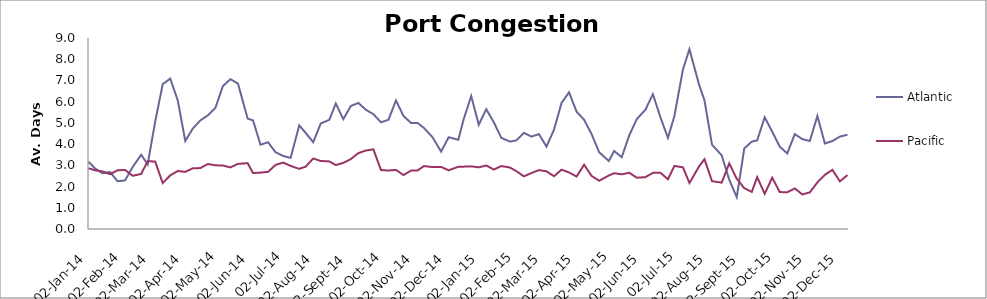
| Category | Atlantic  | Pacific |
|---|---|---|
| 2014-01-02 | 3.167 | 2.863 |
| 2014-01-08 | 2.854 | 2.767 |
| 2014-01-15 | 2.625 | 2.712 |
| 2014-01-22 | 2.688 | 2.582 |
| 2014-01-29 | 2.25 | 2.767 |
| 2014-02-05 | 2.292 | 2.781 |
| 2014-02-12 | 2.917 | 2.507 |
| 2014-02-20 | 3.5 | 2.596 |
| 2014-02-26 | 3.042 | 3.199 |
| 2014-03-05 | 5.059 | 3.178 |
| 2014-03-12 | 6.824 | 2.164 |
| 2014-03-19 | 7.088 | 2.527 |
| 2014-03-26 | 6.059 | 2.733 |
| 2014-04-02 | 4.147 | 2.692 |
| 2014-04-09 | 4.735 | 2.863 |
| 2014-04-16 | 5.118 | 2.87 |
| 2014-04-23 | 5.353 | 3.062 |
| 2014-04-30 | 5.706 | 3 |
| 2014-05-07 | 6.735 | 2.993 |
| 2014-05-14 | 7.059 | 2.904 |
| 2014-05-21 | 6.853 | 3.068 |
| 2014-05-30 | 5.206 | 3.103 |
| 2014-06-04 | 5.118 | 2.637 |
| 2014-06-11 | 3.971 | 2.658 |
| 2014-06-18 | 4.088 | 2.692 |
| 2014-06-25 | 3.618 | 3.021 |
| 2014-07-02 | 3.441 | 3.13 |
| 2014-07-09 | 3.353 | 2.973 |
| 2014-07-17 | 4.882 | 2.836 |
| 2014-07-23 | 4.529 | 2.938 |
| 2014-07-30 | 4.088 | 3.322 |
| 2014-08-06 | 4.971 | 3.205 |
| 2014-08-14 | 5.147 | 3.185 |
| 2014-08-20 | 5.912 | 3.014 |
| 2014-08-27 | 5.176 | 3.116 |
| 2014-09-03 | 5.794 | 3.295 |
| 2014-09-10 | 5.941 | 3.575 |
| 2014-09-17 | 5.618 | 3.699 |
| 2014-09-24 | 5.412 | 3.753 |
| 2014-10-01 | 5.029 | 2.781 |
| 2014-10-08 | 5.147 | 2.753 |
| 2014-10-15 | 6.059 | 2.785 |
| 2014-10-22 | 5.324 | 2.541 |
| 2014-10-29 | 5 | 2.753 |
| 2014-11-04 | 5 | 2.753 |
| 2014-11-10 | 4.765 | 2.966 |
| 2014-11-18 | 4.324 | 2.918 |
| 2014-11-26 | 3.647 | 2.925 |
| 2014-12-03 | 4.324 | 2.767 |
| 2014-12-12 | 4.206 | 2.932 |
| 2014-12-17 | 5.176 | 2.938 |
| 2014-12-24 | 6.265 | 2.952 |
| 2014-12-31 | 4.912 | 2.904 |
| 2015-01-07 | 5.647 | 2.993 |
| 2015-01-14 | 5.029 | 2.801 |
| 2015-01-21 | 4.294 | 2.966 |
| 2015-01-29 | 4.118 | 2.897 |
| 2015-02-04 | 4.176 | 2.726 |
| 2015-02-11 | 4.529 | 2.479 |
| 2015-02-18 | 4.353 | 2.637 |
| 2015-02-25 | 4.471 | 2.774 |
| 2015-03-04 | 3.882 | 2.719 |
| 2015-03-11 | 4.676 | 2.486 |
| 2015-03-18 | 5.941 | 2.795 |
| 2015-03-25 | 6.441 | 2.664 |
| 2015-04-01 | 5.529 | 2.473 |
| 2015-04-08 | 5.147 | 3.027 |
| 2015-04-15 | 4.471 | 2.5 |
| 2015-04-22 | 3.618 | 2.274 |
| 2015-05-01 | 3.206 | 2.521 |
| 2015-05-06 | 3.676 | 2.63 |
| 2015-05-13 | 3.382 | 2.575 |
| 2015-05-20 | 4.412 | 2.651 |
| 2015-05-27 | 5.176 | 2.418 |
| 2015-06-04 | 5.618 | 2.442 |
| 2015-06-11 | 6.353 | 2.645 |
| 2015-06-18 | 5.265 | 2.651 |
| 2015-06-25 | 4.294 | 2.342 |
| 2015-07-01 | 5.324 | 2.973 |
| 2015-07-09 | 7.529 | 2.904 |
| 2015-07-15 | 8.471 | 2.168 |
| 2015-07-24 | 6.794 | 2.952 |
| 2015-07-29 | 6.059 | 3.288 |
| 2015-08-05 | 3.971 | 2.253 |
| 2015-08-14 | 3.471 | 2.185 |
| 2015-08-21 | 2.324 | 3.089 |
| 2015-08-28 | 1.5 | 2.37 |
| 2015-09-04 | 3.794 | 1.925 |
| 2015-09-11 | 4.118 | 1.747 |
| 2015-09-16 | 4.176 | 2.445 |
| 2015-09-23 | 5.265 | 1.658 |
| 2015-09-30 | 4.588 | 2.418 |
| 2015-10-07 | 3.882 | 1.74 |
| 2015-10-14 | 3.559 | 1.733 |
| 2015-10-21 | 4.471 | 1.911 |
| 2015-10-28 | 4.235 | 1.63 |
| 2015-11-04 | 4.147 | 1.726 |
| 2015-11-11 | 5.324 | 2.192 |
| 2015-11-18 | 4.029 | 2.555 |
| 2015-11-25 | 4.147 | 2.788 |
| 2015-12-02 | 4.353 | 2.247 |
| 2015-12-09 | 4.441 | 2.541 |